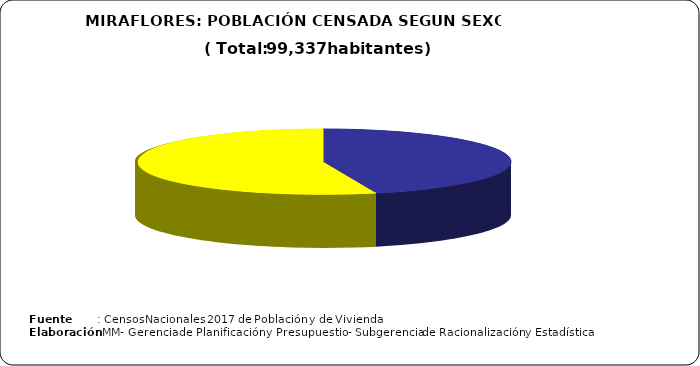
| Category | Series 0 |
|---|---|
| HOMBRES | 45152 |
| MUJERES | 54185 |